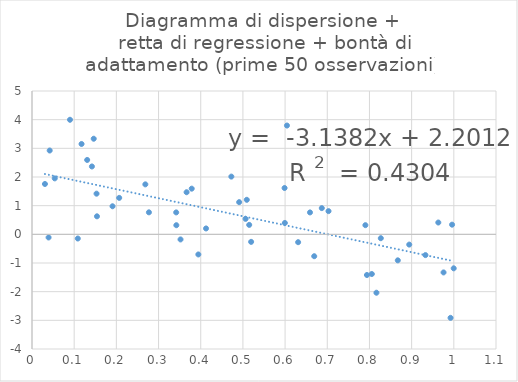
| Category | Series 0 |
|---|---|
| 0.20672523636471407 | 1.272 |
| 0.1909025193908992 | 0.979 |
| 0.9997555057780091 | -1.185 |
| 0.36649981919895125 | 1.469 |
| 0.7940271604756531 | -1.419 |
| 0.10855633568076473 | -0.146 |
| 0.412602703366748 | 0.205 |
| 0.2686896289094446 | 1.743 |
| 0.5994526903643376 | 0.397 |
| 0.2771807183867323 | 0.767 |
| 0.49112038994101814 | 1.123 |
| 0.5149139275332283 | 0.33 |
| 0.6690588175552148 | -0.763 |
| 0.6309163343113446 | -0.274 |
| 0.8672088283356914 | -0.907 |
| 0.09007021243255464 | 3.996 |
| 0.9958693042496355 | 0.337 |
| 0.8943178317866542 | -0.358 |
| 0.15402241204348655 | 0.628 |
| 0.6044444780941413 | 3.795 |
| 0.6870340730838718 | 0.915 |
| 0.3943683243768936 | -0.702 |
| 0.4725968746383167 | 2.014 |
| 0.34218796647733196 | 0.318 |
| 0.15300922242346982 | 1.418 |
| 0.04195572636058775 | 2.924 |
| 0.14631926917705218 | 3.335 |
| 0.9756618689364218 | -1.329 |
| 0.5063557493858747 | 0.54 |
| 0.9922551148500682 | -2.914 |
| 0.35211819430933 | -0.178 |
| 0.6590411255997116 | 0.764 |
| 0.598761990867731 | 1.616 |
| 0.9327619353074678 | -0.724 |
| 0.3786334061416937 | 1.593 |
| 0.0306600311128995 | 1.756 |
| 0.13082576015105207 | 2.595 |
| 0.7029395124079307 | 0.809 |
| 0.9632284240568897 | 0.412 |
| 0.8165563032014854 | -2.037 |
| 0.509197389026009 | 1.204 |
| 0.7903520436611269 | 0.32 |
| 0.34184218097544494 | 0.765 |
| 0.5194966819167923 | -0.263 |
| 0.82692874206228 | -0.135 |
| 0.03931370395508216 | -0.109 |
| 0.11748515013498151 | 3.152 |
| 0.14205092845201883 | 2.367 |
| 0.0539113128532821 | 1.952 |
| 0.8055861612187732 | -1.384 |